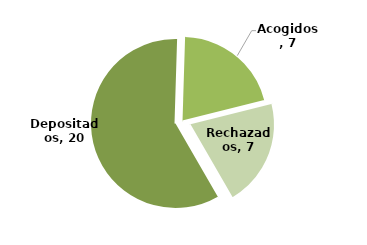
| Category | Series 0 |
|---|---|
| Depositados | 20 |
| Acogidos | 7 |
| Rechazados | 7 |